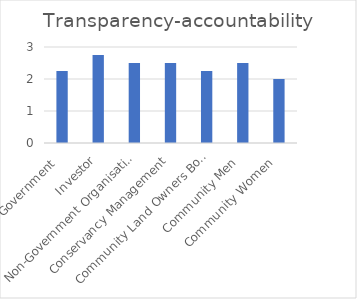
| Category | Transparency-accountability |
|---|---|
| Government  | 2.25 |
| Investor | 2.75 |
| Non-Government Organisations | 2.5 |
| Conservancy Management | 2.5 |
| Community Land Owners Board | 2.25 |
| Community Men  | 2.5 |
| Community Women  | 2 |